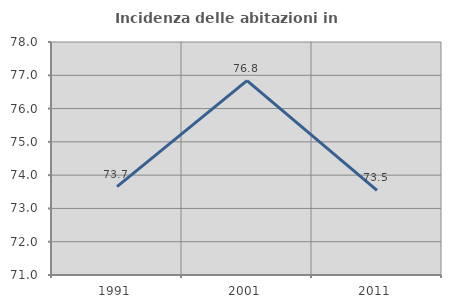
| Category | Incidenza delle abitazioni in proprietà  |
|---|---|
| 1991.0 | 73.653 |
| 2001.0 | 76.842 |
| 2011.0 | 73.545 |